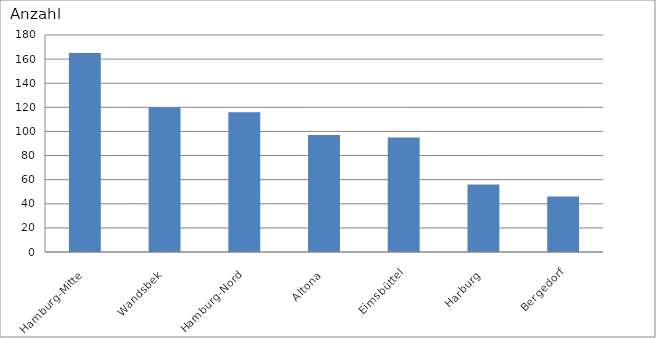
| Category | Hamburg-Mitte |
|---|---|
| Hamburg-Mitte | 165 |
| Wandsbek | 120 |
| Hamburg-Nord | 116 |
| Altona | 97 |
| Eimsbüttel | 95 |
| Harburg | 56 |
| Bergedorf | 46 |